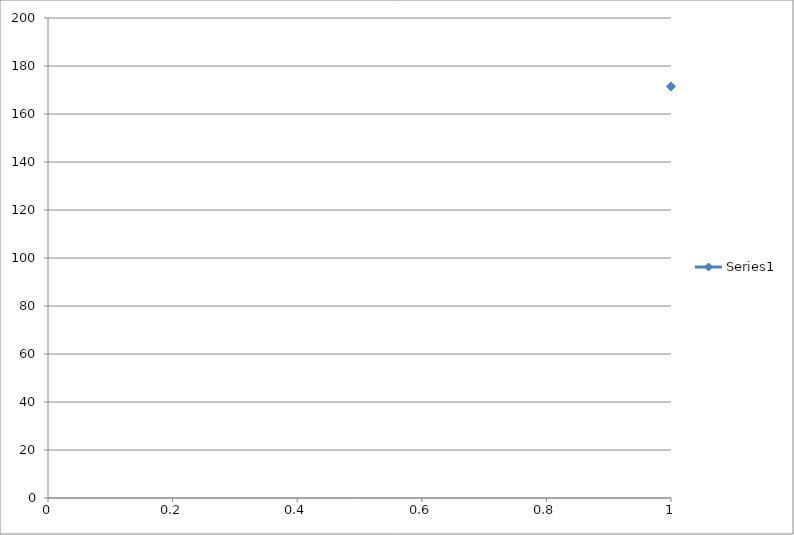
| Category | Series 0 |
|---|---|
| 0 | 171.5 |
| 1 | 159.8 |
| 2 | 133.4 |
| 3 | 128.4 |
| 4 | 126.5 |
| 5 | 128.5 |
| 6 | 129.9 |
| 7 | 137.6 |
| 8 | 135.3 |
| 9 | 132 |
| 10 | 128.8 |
| 11 | 130.6 |
| 12 | 128.9 |
| 13 | 129 |
| 14 | 128.8 |
| 15 | 135.4 |
| 16 | 134.3 |
| 17 | 133.4 |
| 18 | 127.1 |
| 19 | 133.1 |
| 20 | 133.1 |
| 21 | 139.4 |
| 22 | 131.7 |
| 23 | 128.9 |
| 24 | 128.9 |
| 25 | 126.5 |
| 26 | 132.5 |
| 27 | 133.6 |
| 28 | 129.5 |
| 29 | 135 |
| 30 | 131.7 |